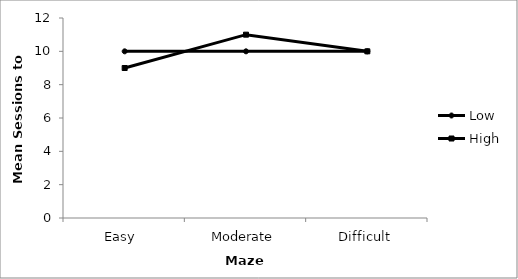
| Category | Low | High |
|---|---|---|
| Easy  | 10 | 9 |
| Moderate | 10 | 11 |
| Difficult | 10 | 10 |